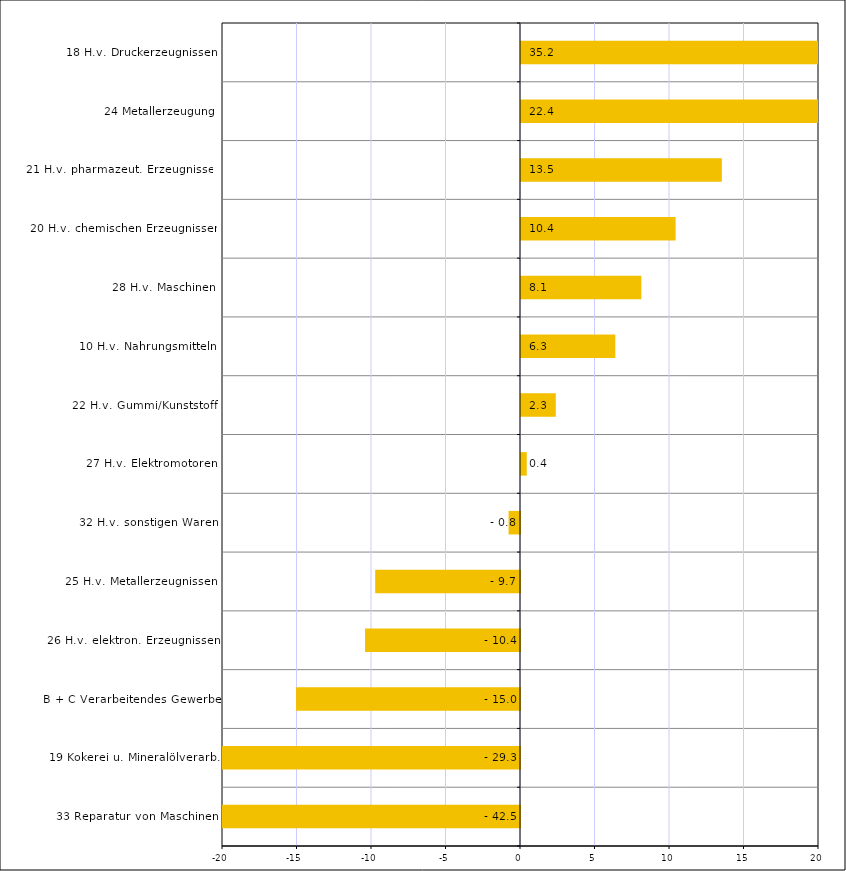
| Category | Series 0 |
|---|---|
| 33 Reparatur von Maschinen | -42.466 |
| 19 Kokerei u. Mineralölverarb. | -29.31 |
| B + C Verarbeitendes Gewerbe | -15.031 |
| 26 H.v. elektron. Erzeugnissen | -10.398 |
| 25 H.v. Metallerzeugnissen | -9.719 |
| 32 H.v. sonstigen Waren | -0.766 |
| 27 H.v. Elektromotoren | 0.386 |
| 22 H.v. Gummi/Kunststoff | 2.337 |
| 10 H.v. Nahrungsmitteln | 6.328 |
| 28 H.v. Maschinen | 8.075 |
| 20 H.v. chemischen Erzeugnissen | 10.376 |
| 21 H.v. pharmazeut. Erzeugnissen | 13.48 |
| 24 Metallerzeugung | 22.44 |
| 18 H.v. Druckerzeugnissen | 35.176 |